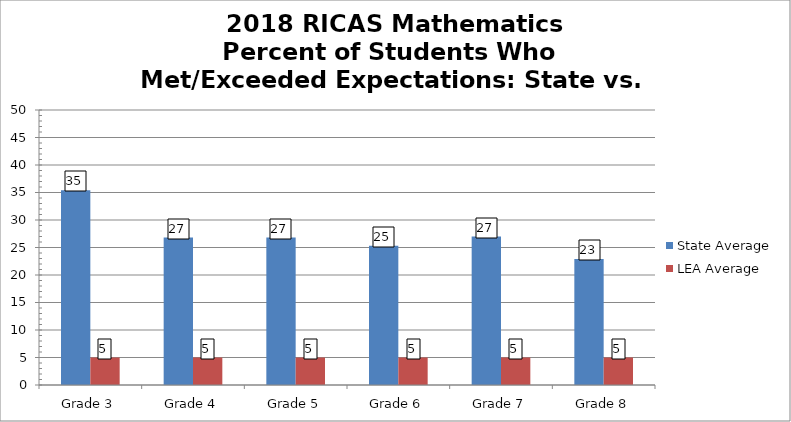
| Category | State Average | LEA Average |
|---|---|---|
| Grade 3 | 35.4 | 5 |
| Grade 4 | 26.8 | 5 |
| Grade 5 | 26.8 | 5 |
| Grade 6 | 25.3 | 5 |
| Grade 7 | 27 | 5 |
| Grade 8 | 22.9 | 5 |